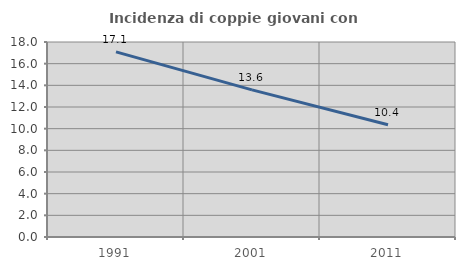
| Category | Incidenza di coppie giovani con figli |
|---|---|
| 1991.0 | 17.09 |
| 2001.0 | 13.585 |
| 2011.0 | 10.357 |